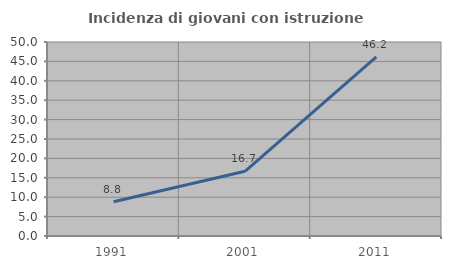
| Category | Incidenza di giovani con istruzione universitaria |
|---|---|
| 1991.0 | 8.824 |
| 2001.0 | 16.667 |
| 2011.0 | 46.154 |